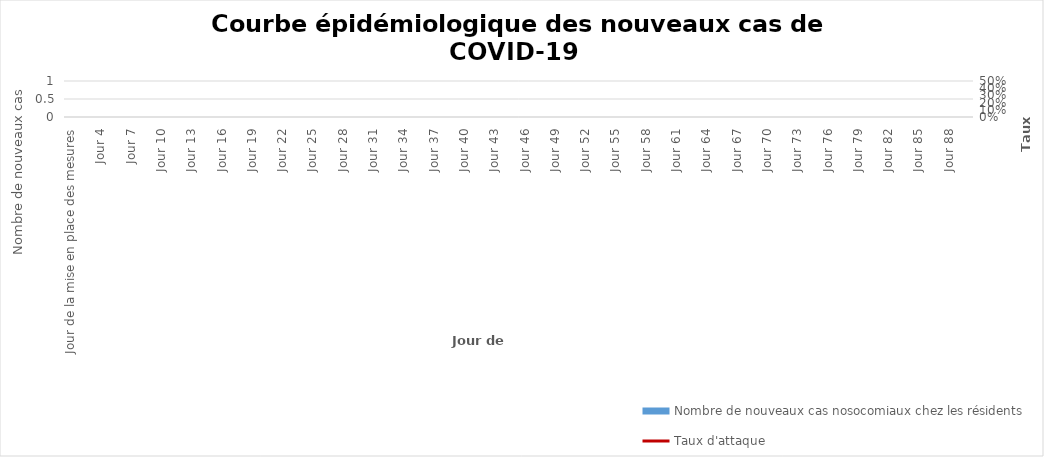
| Category | Nombre de nouveaux cas nosocomiaux chez les résidents |
|---|---|
| Jour de la mise en place des mesures | 0 |
| Jour 2 | 0 |
| Jour 3 | 0 |
| Jour 4 | 0 |
| Jour 5 | 0 |
| Jour 6 | 0 |
| Jour 7 | 0 |
| Jour 8 | 0 |
| Jour 9 | 0 |
| Jour 10 | 0 |
| Jour 11 | 0 |
| Jour 12 | 0 |
| Jour 13 | 0 |
| Jour 14 | 0 |
| Jour 15 | 0 |
| Jour 16 | 0 |
| Jour 17 | 0 |
| Jour 18 | 0 |
| Jour 19 | 0 |
| Jour 20 | 0 |
| Jour 21 | 0 |
| Jour 22 | 0 |
| Jour 23 | 0 |
| Jour 24 | 0 |
| Jour 25 | 0 |
| Jour 26 | 0 |
| Jour 27 | 0 |
| Jour 28 | 0 |
| Jour 29 | 0 |
| Jour 30 | 0 |
| Jour 31 | 0 |
| Jour 32 | 0 |
| Jour 33 | 0 |
| Jour 34 | 0 |
| Jour 35 | 0 |
| Jour 36 | 0 |
| Jour 37 | 0 |
| Jour 38 | 0 |
| Jour 39 | 0 |
| Jour 40 | 0 |
| Jour 41 | 0 |
| Jour 42 | 0 |
| Jour 43 | 0 |
| Jour 44 | 0 |
| Jour 45 | 0 |
| Jour 46 | 0 |
| Jour 47 | 0 |
| Jour 48 | 0 |
| Jour 49 | 0 |
| Jour 50 | 0 |
| Jour 51 | 0 |
| Jour 52 | 0 |
| Jour 53 | 0 |
| Jour 54 | 0 |
| Jour 55 | 0 |
| Jour 56 | 0 |
| Jour 57 | 0 |
| Jour 58 | 0 |
| Jour 59 | 0 |
| Jour 60 | 0 |
| Jour 61 | 0 |
| Jour 62 | 0 |
| Jour 63 | 0 |
| Jour 64 | 0 |
| Jour 65 | 0 |
| Jour 66 | 0 |
| Jour 67 | 0 |
| Jour 68 | 0 |
| Jour 69 | 0 |
| Jour 70 | 0 |
| Jour 71 | 0 |
| Jour 72 | 0 |
| Jour 73 | 0 |
| Jour 74 | 0 |
| Jour 75 | 0 |
| Jour 76 | 0 |
| Jour 77 | 0 |
| Jour 78 | 0 |
| Jour 79 | 0 |
| Jour 80 | 0 |
| Jour 81 | 0 |
| Jour 82 | 0 |
| Jour 83 | 0 |
| Jour 84 | 0 |
| Jour 85 | 0 |
| Jour 86 | 0 |
| Jour 87 | 0 |
| Jour 88 | 0 |
| Jour 89 | 0 |
| Jour 90 | 0 |